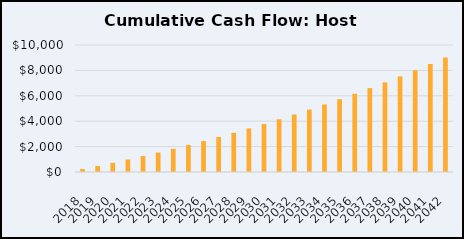
| Category | Series 0 |
|---|---|
| 2018.0 | 232.446 |
| 2019.0 | 473.911 |
| 2020.0 | 724.591 |
| 2021.0 | 984.683 |
| 2022.0 | 1254.388 |
| 2023.0 | 1533.911 |
| 2024.0 | 1823.463 |
| 2025.0 | 2123.257 |
| 2026.0 | 2433.51 |
| 2027.0 | 2754.445 |
| 2028.0 | 3086.287 |
| 2029.0 | 3429.267 |
| 2030.0 | 3783.62 |
| 2031.0 | 4149.585 |
| 2032.0 | 4527.406 |
| 2033.0 | 4917.331 |
| 2034.0 | 5319.614 |
| 2035.0 | 5734.512 |
| 2036.0 | 6162.287 |
| 2037.0 | 6603.207 |
| 2038.0 | 7057.544 |
| 2039.0 | 7525.576 |
| 2040.0 | 8007.584 |
| 2041.0 | 8503.856 |
| 2042.0 | 9014.685 |